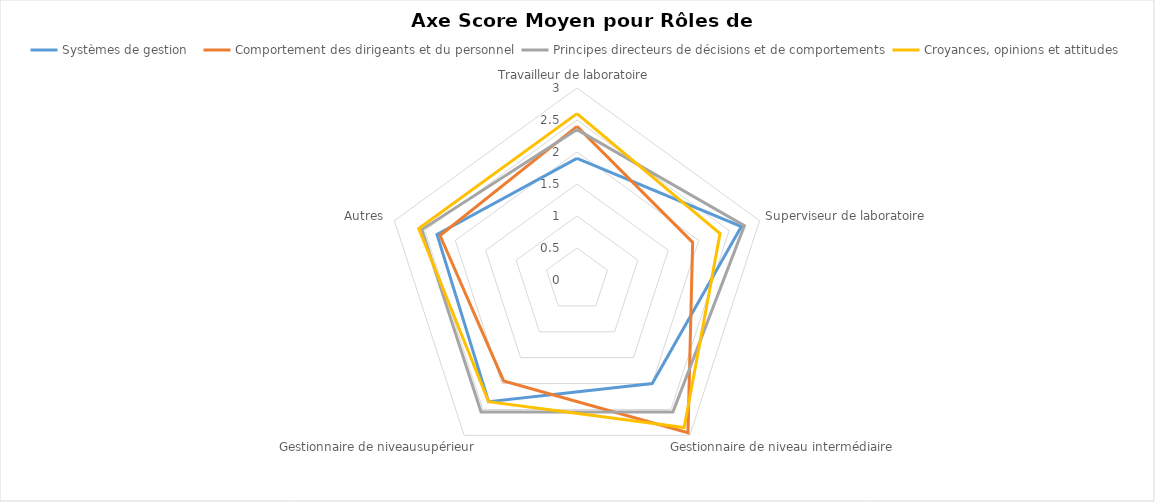
| Category | Systèmes de gestion
 | Comportement des dirigeants et du personnel | Principes directeurs de décisions et de comportements | Croyances, opinions et attitudes |
|---|---|---|---|---|
| Travailleur de laboratoire | 1.9 | 2.4 | 2.35 | 2.6 |
| Superviseur de laboratoire | 2.7 | 1.9 | 2.75 | 2.35 |
| Gestionnaire de niveau intermédiaire | 2 | 2.95 | 2.55 | 2.85 |
| Gestionnaire de niveausupérieur | 2.35 | 1.95 | 2.55 | 2.35 |
| Autres | 2.3 | 2.25 | 2.55 | 2.6 |